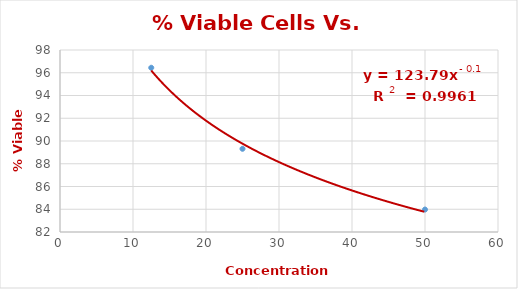
| Category | Series 0 |
|---|---|
| 50.0 | 83.974 |
| 25.0 | 89.316 |
| 12.5 | 96.439 |